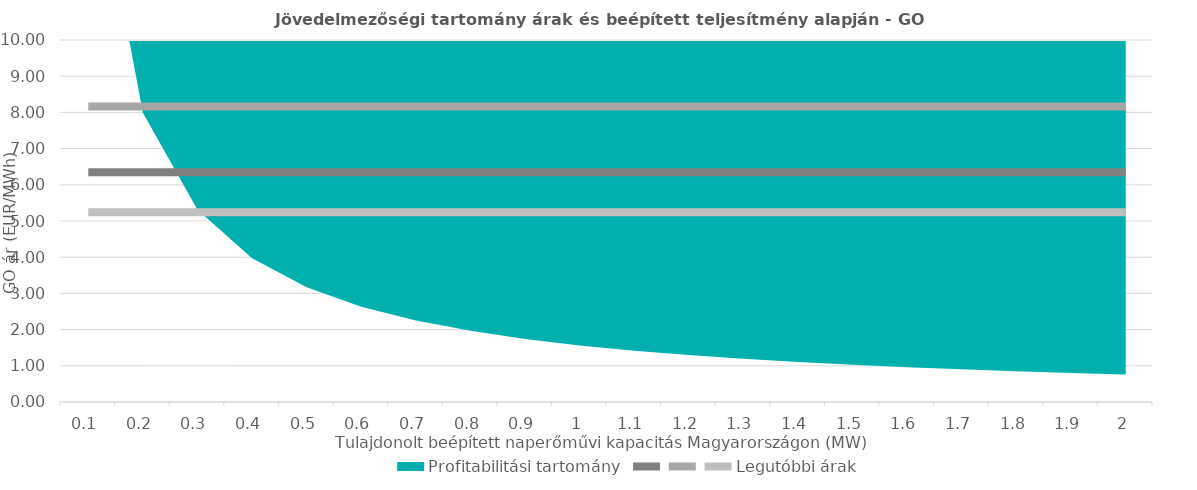
| Category | Series 2 | Series 3 |   Legutóbbi árak |
|---|---|---|---|
| 0.1 | 6.35 | 8.16 | 5.24 |
| 0.2 | 6.35 | 8.16 | 5.24 |
| 0.3 | 6.35 | 8.16 | 5.24 |
| 0.4 | 6.35 | 8.16 | 5.24 |
| 0.5 | 6.35 | 8.16 | 5.24 |
| 0.6 | 6.35 | 8.16 | 5.24 |
| 0.7 | 6.35 | 8.16 | 5.24 |
| 0.8 | 6.35 | 8.16 | 5.24 |
| 0.9 | 6.35 | 8.16 | 5.24 |
| 1.0 | 6.35 | 8.16 | 5.24 |
| 1.1 | 6.35 | 8.16 | 5.24 |
| 1.2 | 6.35 | 8.16 | 5.24 |
| 1.3 | 6.35 | 8.16 | 5.24 |
| 1.4 | 6.35 | 8.16 | 5.24 |
| 1.5 | 6.35 | 8.16 | 5.24 |
| 1.6 | 6.35 | 8.16 | 5.24 |
| 1.7 | 6.35 | 8.16 | 5.24 |
| 1.8 | 6.35 | 8.16 | 5.24 |
| 1.9 | 6.35 | 8.16 | 5.24 |
| 2.0 | 6.35 | 8.16 | 5.24 |